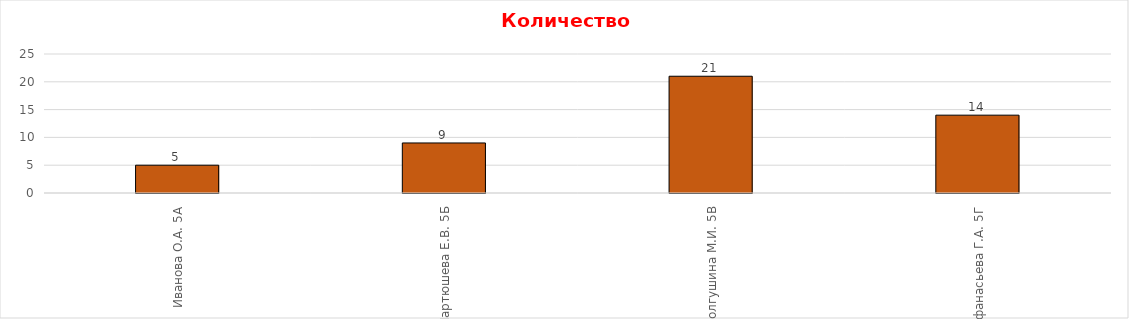
| Category | "4" |
|---|---|
| Иванова О.А. 5А | 5 |
| Мартюшева Е.В. 5Б | 9 |
| Долгушина М.И. 5В | 21 |
| Афанасьева Г.А. 5Г | 14 |